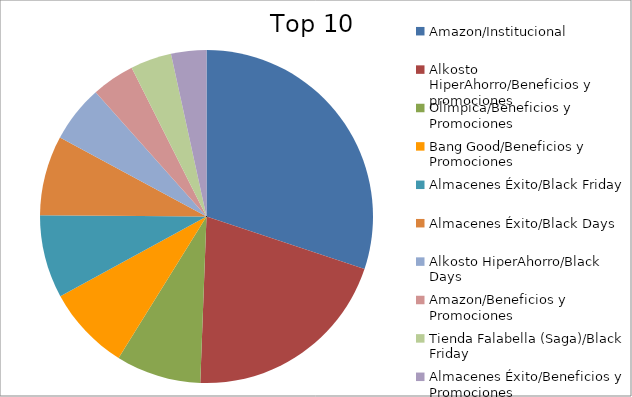
| Category | Series 0 |
|---|---|
| Amazon/Institucional | 22.68 |
| Alkosto HiperAhorro/Beneficios y promociones | 15.43 |
| Olimpica/Beneficios y Promociones | 6.22 |
| Bang Good/Beneficios y Promociones | 6.17 |
| Almacenes Éxito/Black Friday | 6.08 |
| Almacenes Éxito/Black Days | 5.84 |
| Alkosto HiperAhorro/Black Days | 4.17 |
| Amazon/Beneficios y Promociones | 3.14 |
| Tienda Falabella (Saga)/Black Friday | 3.01 |
| Almacenes Éxito/Beneficios y Promociones | 2.58 |